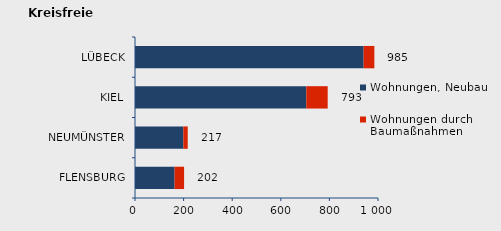
| Category | Wohnungen, Neubau | Wohnungen durch Baumaßnahmen | Series 2 |
|---|---|---|---|
| FLENSBURG | 163 | 39 | 202 |
| NEUMÜNSTER | 199 | 18 | 217 |
| KIEL | 705 | 88 | 793 |
| LÜBECK | 941 | 44 | 985 |